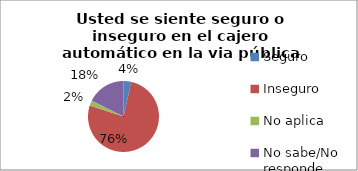
| Category | Series 0 |
|---|---|
| Seguro | 0.035 |
| Inseguro | 0.765 |
| No aplica | 0.024 |
| No sabe/No responde | 0.176 |